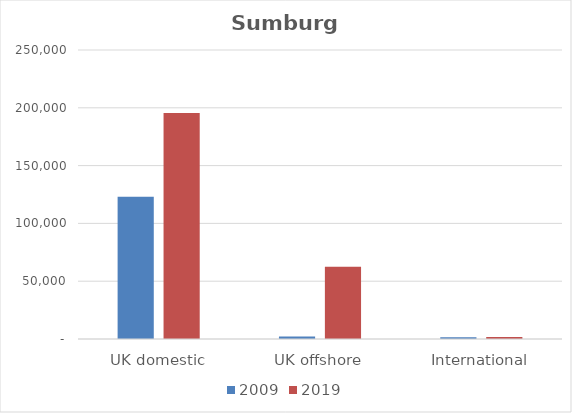
| Category | 2009 | 2019 |
|---|---|---|
| UK domestic | 123079 | 195587 |
| UK offshore | 2055 | 62419 |
| International | 1548 | 1778 |